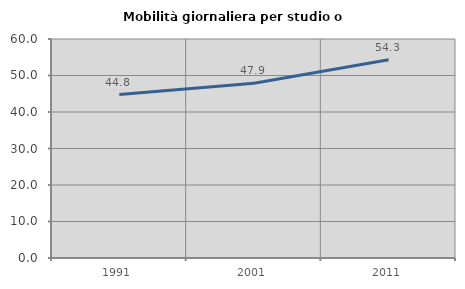
| Category | Mobilità giornaliera per studio o lavoro |
|---|---|
| 1991.0 | 44.762 |
| 2001.0 | 47.887 |
| 2011.0 | 54.321 |